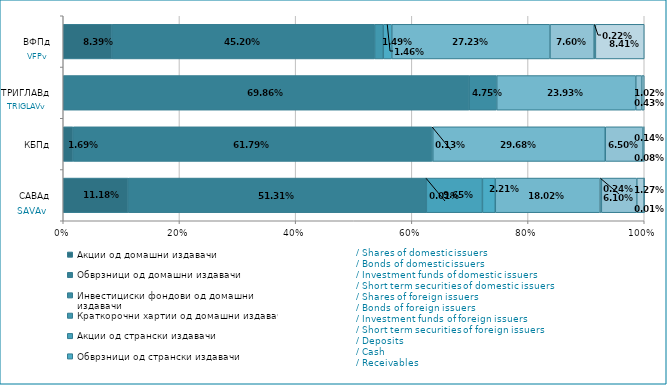
| Category | Акции од домашни издавачи  | Обврзници од домашни издавачи  | Инвестициски фондови од домашни издавачи   | Краткорочни хартии од домашни издавачи   | Акции од странски издавачи   | Обврзници од странски издавачи  | Инвестициски фондови од странски издавaчи  | Краткорочни хартии од странски издавачи  | Депозити | Парични средства | Побарувања |
|---|---|---|---|---|---|---|---|---|---|---|---|
| САВАд | 0.112 | 0.513 | 0 | 0 | 0.097 | 0.022 | 0.18 | 0.002 | 0.061 | 0.013 | 0 |
| КБПд | 0.017 | 0.618 | 0.001 | 0 | 0 | 0 | 0.297 | 0 | 0.065 | 0.001 | 0.001 |
| ТРИГЛАВд | 0 | 0.699 | 0.047 | 0 | 0 | 0 | 0.239 | 0 | 0.01 | 0.004 | 0 |
| ВФПд | 0.084 | 0.452 | 0 | 0.015 | 0 | 0.015 | 0.272 | 0 | 0.076 | 0.002 | 0.084 |